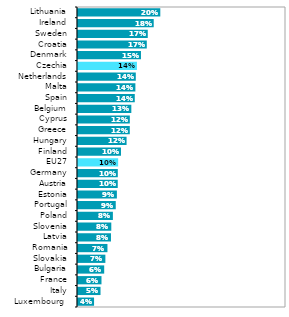
| Category | Series 1 |
|---|---|
| Luxembourg  | 0.039 |
| Italy | 0.054 |
| France | 0.056 |
| Bulgaria | 0.063 |
| Slovakia | 0.066 |
| Romania | 0.071 |
| Latvia | 0.079 |
| Slovenia | 0.08 |
| Poland | 0.084 |
| Portugal | 0.091 |
| Estonia | 0.093 |
| Austria | 0.096 |
| Germany | 0.096 |
| EU27 | 0.097 |
| Finland | 0.103 |
| Hungary | 0.117 |
| Greece | 0.124 |
| Cyprus | 0.125 |
| Belgium | 0.128 |
| Spain | 0.136 |
| Malta | 0.138 |
| Netherlands | 0.139 |
| Czechia | 0.142 |
| Denmark | 0.151 |
| Croatia | 0.165 |
| Sweden | 0.168 |
| Ireland | 0.182 |
| Lithuania | 0.198 |